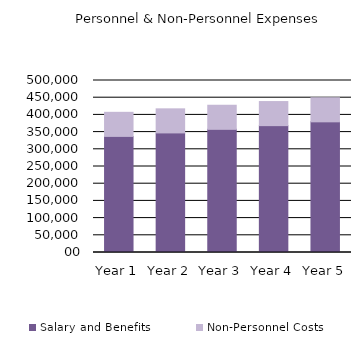
| Category | Salary and Benefits | Non-Personnel Costs |
|---|---|---|
| 1.0 | 337500 | 70000 |
| 2.0 | 347625 | 70000 |
| 3.0 | 358053.75 | 70000 |
| 4.0 | 368795.362 | 70000 |
| 5.0 | 379859.223 | 70000 |